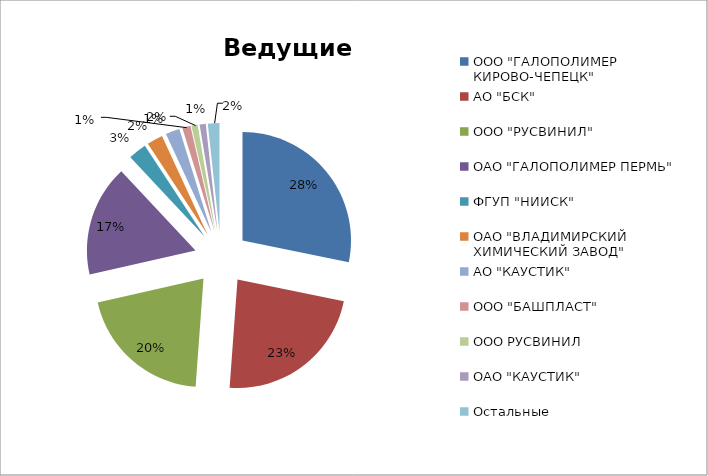
| Category | Стоимость, USD |
|---|---|
| ООО "ГАЛОПОЛИМЕР КИРОВО-ЧЕПЕЦК" | 2802336.1 |
| АО "БСК" | 2281723.9 |
| ООО "РУСВИНИЛ" | 2018161.76 |
| ОАО "ГАЛОПОЛИМЕР ПЕРМЬ" | 1644432.1 |
| ФГУП "НИИСК" | 270850 |
| ОАО "ВЛАДИМИРСКИЙ ХИМИЧЕСКИЙ ЗАВОД" | 235504.61 |
| АО "КАУСТИК" | 208313.22 |
| ООО "БАШПЛАСТ" | 121674.15 |
| ООО РУСВИНИЛ | 91899.81 |
| ОАО "КАУСТИК" | 91443.22 |
| Остальные | 171467.78 |